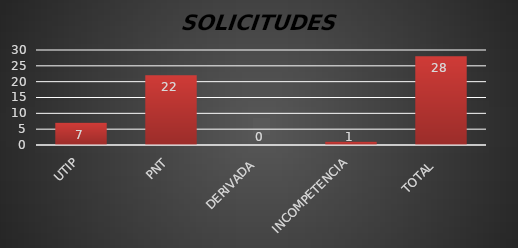
| Category | Series 1 |
|---|---|
| UTIP | 7 |
| PNT | 22 |
| DERIVADA  | 0 |
| INCOMPETENCIA | 1 |
| TOTAL  | 28 |